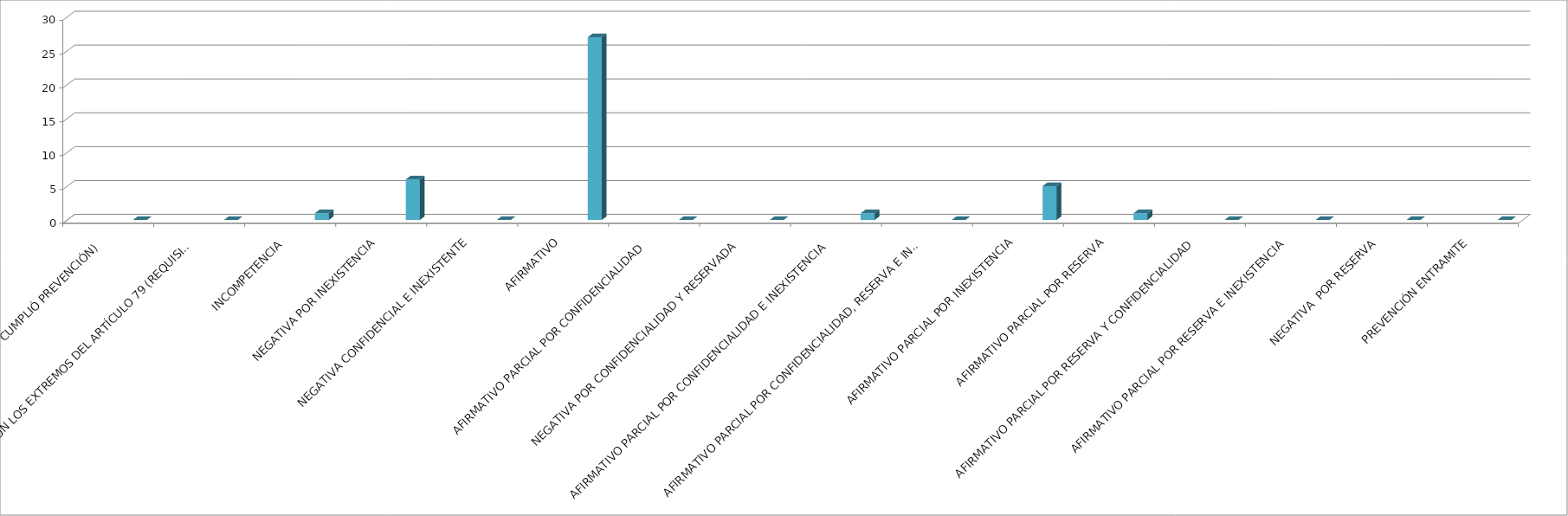
| Category | Series 0 | Series 1 | Series 2 | Series 3 | Series 4 |
|---|---|---|---|---|---|
| SE TIENE POR NO PRESENTADA ( NO CUMPLIÓ PREVENCIÓN) |  |  |  |  | 0 |
| NO CUMPLIO CON LOS EXTREMOS DEL ARTÍCULO 79 (REQUISITOS) |  |  |  |  | 0 |
| INCOMPETENCIA  |  |  |  |  | 1 |
| NEGATIVA POR INEXISTENCIA |  |  |  |  | 6 |
| NEGATIVA CONFIDENCIAL E INEXISTENTE |  |  |  |  | 0 |
| AFIRMATIVO |  |  |  |  | 27 |
| AFIRMATIVO PARCIAL POR CONFIDENCIALIDAD  |  |  |  |  | 0 |
| NEGATIVA POR CONFIDENCIALIDAD Y RESERVADA |  |  |  |  | 0 |
| AFIRMATIVO PARCIAL POR CONFIDENCIALIDAD E INEXISTENCIA |  |  |  |  | 1 |
| AFIRMATIVO PARCIAL POR CONFIDENCIALIDAD, RESERVA E INEXISTENCIA |  |  |  |  | 0 |
| AFIRMATIVO PARCIAL POR INEXISTENCIA |  |  |  |  | 5 |
| AFIRMATIVO PARCIAL POR RESERVA |  |  |  |  | 1 |
| AFIRMATIVO PARCIAL POR RESERVA Y CONFIDENCIALIDAD |  |  |  |  | 0 |
| AFIRMATIVO PARCIAL POR RESERVA E INEXISTENCIA |  |  |  |  | 0 |
| NEGATIVA  POR RESERVA |  |  |  |  | 0 |
| PREVENCIÓN ENTRAMITE |  |  |  |  | 0 |